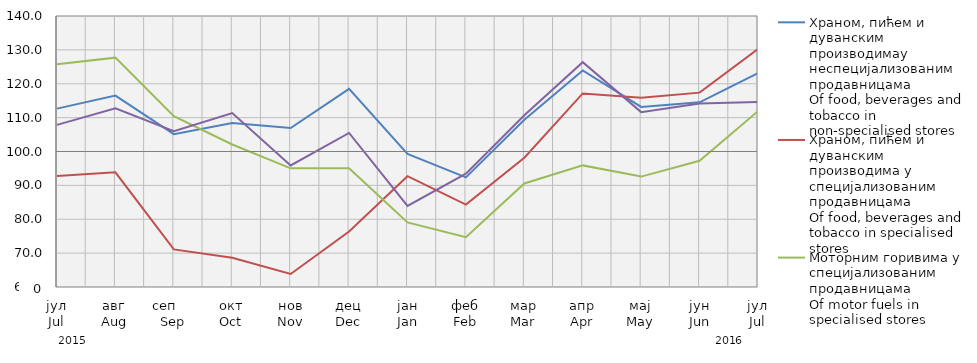
| Category | Храном, пићем и дуванским производимау неспецијализованим продавницама
Of food, beverages and tobacco in non-specialised stores
 | Храном, пићем и дуванским производима у специјализовaним продавницама
Оf food, beverages and tobacco in specialised stores | Моторним горивима у специјализованим продавницама
Of motor fuels in specialised stores | Остала
Other |
|---|---|---|---|---|
| јул
Jul | 112.664 | 92.74 | 125.76 | 107.864 |
| авг
Aug | 116.519 | 93.864 | 127.707 | 112.769 |
| сеп     Sep | 105.123 | 71.088 | 110.411 | 106.02 |
| окт
Oct | 108.393 | 68.621 | 102.068 | 111.365 |
| нов
Nov | 106.938 | 63.847 | 95.032 | 95.869 |
| дец
Dec | 118.498 | 76.368 | 95.084 | 105.475 |
| јан
Jan | 99.255 | 92.722 | 79.068 | 83.94 |
| феб
Feb | 92.363 | 84.339 | 74.7 | 93.451 |
| мар
Mar | 109.349 | 98.183 | 90.564 | 110.695 |
| апр
Apr | 123.935 | 117.147 | 95.897 | 126.373 |
| мај
May | 113.15 | 115.884 | 92.592 | 111.621 |
| јун
Jun | 114.503 | 117.373 | 97.274 | 114.134 |
| јул
Jul | 123.119 | 130.235 | 111.897 | 114.647 |